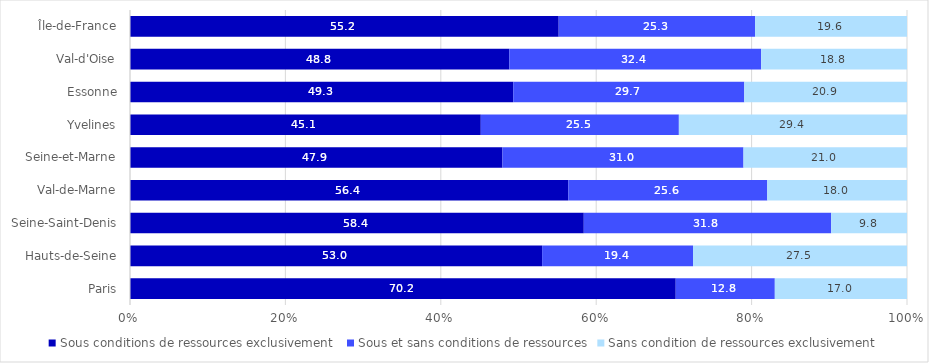
| Category | Sous conditions de ressources exclusivement  | Sous et sans conditions de ressources | Sans condition de ressources exclusivement |
|---|---|---|---|
| Paris | 70.236 | 12.752 | 17.013 |
| Hauts-de-Seine | 53.04 | 19.422 | 27.538 |
| Seine-Saint-Denis | 58.402 | 31.835 | 9.762 |
| Val-de-Marne | 56.408 | 25.611 | 17.981 |
| Seine-et-Marne | 47.933 | 31.023 | 21.044 |
| Yvelines | 45.148 | 25.491 | 29.361 |
| Essonne | 49.322 | 29.737 | 20.942 |
| Val-d'Oise | 48.815 | 32.413 | 18.773 |
| Île-de-France | 55.173 | 25.271 | 19.556 |